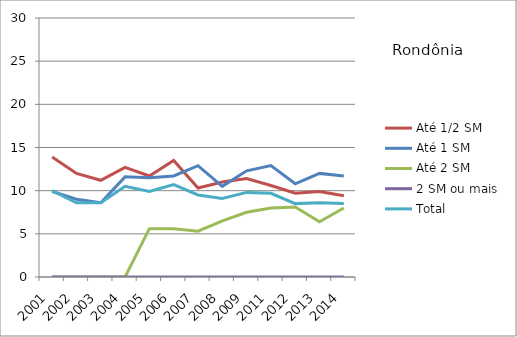
| Category | Até 1/2 SM | Até 1 SM | Até 2 SM | 2 SM ou mais | Total |
|---|---|---|---|---|---|
| 2001.0 | 13.9 | 9.9 | 0 | 0 | 10 |
| 2002.0 | 12 | 9 | 0 | 0 | 8.6 |
| 2003.0 | 11.2 | 8.6 | 0 | 0 | 8.6 |
| 2004.0 | 12.7 | 11.6 | 0 | 0 | 10.5 |
| 2005.0 | 11.7 | 11.5 | 5.6 | 0 | 9.9 |
| 2006.0 | 13.5 | 11.7 | 5.6 | 0 | 10.7 |
| 2007.0 | 10.3 | 12.9 | 5.3 | 0 | 9.5 |
| 2008.0 | 11 | 10.5 | 6.5 | 0 | 9.1 |
| 2009.0 | 11.4 | 12.3 | 7.5 | 0 | 9.8 |
| 2011.0 | 10.6 | 12.9 | 8 | 0 | 9.7 |
| 2012.0 | 9.7 | 10.8 | 8.1 | 0 | 8.5 |
| 2013.0 | 9.9 | 12 | 6.4 | 0 | 8.6 |
| 2014.0 | 9.4 | 11.7 | 8 | 0 | 8.5 |